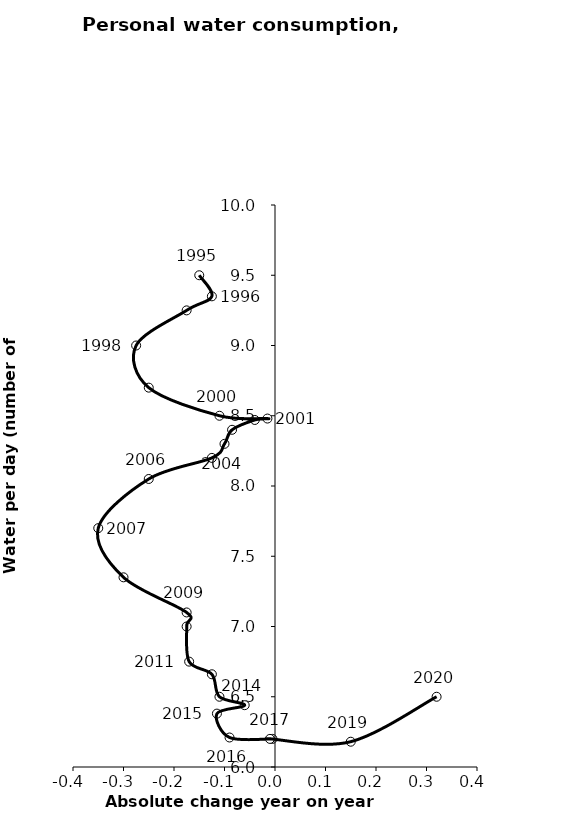
| Category | Series 0 |
|---|---|
| -0.15000000000000036 | 9.5 |
| -0.125 | 9.35 |
| -0.17499999999999982 | 9.25 |
| -0.27500000000000036 | 9 |
| -0.25 | 8.7 |
| -0.10999999999999943 | 8.5 |
| -0.01499999999999968 | 8.48 |
| -0.040000000000000036 | 8.47 |
| -0.08499999999999996 | 8.4 |
| -0.10000000000000053 | 8.3 |
| -0.125 | 8.2 |
| -0.24999999999999956 | 8.05 |
| -0.35000000000000053 | 7.7 |
| -0.30000000000000027 | 7.35 |
| -0.17499999999999982 | 7.1 |
| -0.17499999999999982 | 7 |
| -0.16999999999999993 | 6.75 |
| -0.125 | 6.66 |
| -0.10999999999999988 | 6.5 |
| -0.06000000000000005 | 6.44 |
| -0.11500000000000021 | 6.38 |
| -0.08999999999999986 | 6.21 |
| -0.004999999999999893 | 6.2 |
| -0.010000000000000231 | 6.2 |
| 0.1499999999999999 | 6.18 |
| 0.3200000000000003 | 6.5 |